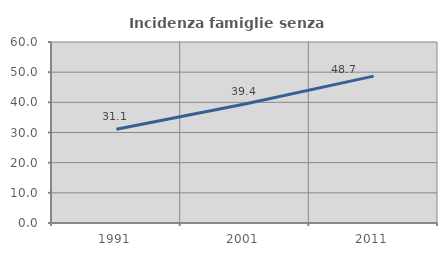
| Category | Incidenza famiglie senza nuclei |
|---|---|
| 1991.0 | 31.072 |
| 2001.0 | 39.444 |
| 2011.0 | 48.68 |